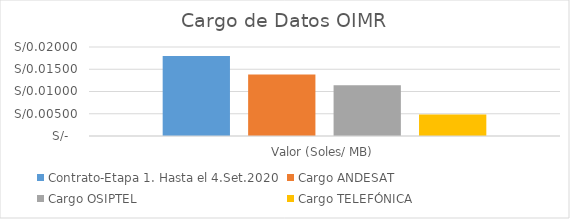
| Category | Contrato-Etapa 1. Hasta el 4.Set.2020 | Cargo ANDESAT | Cargo OSIPTEL | Cargo TELEFÓNICA |
|---|---|---|---|---|
| Valor (Soles/ MB) | 0.018 | 0.014 | 0.011 | 0.005 |